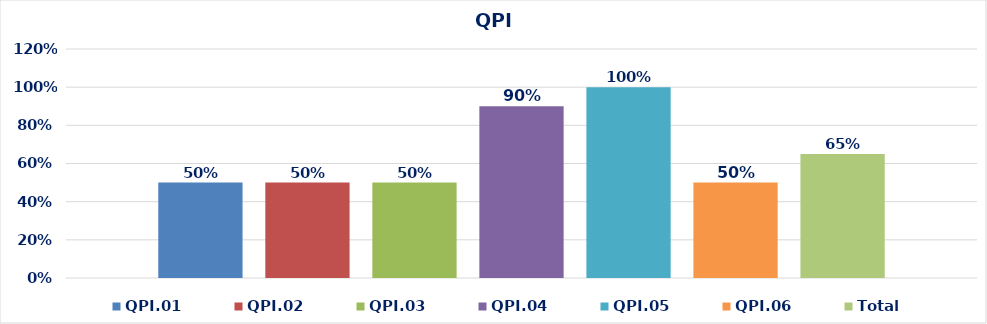
| Category | QPI.01 | QPI.02 | QPI.03 | QPI.04 | QPI.05 | QPI.06 | Total |
|---|---|---|---|---|---|---|---|
| 0 | 0.5 | 0.5 | 0.5 | 0.9 | 1 | 0.5 | 0.65 |